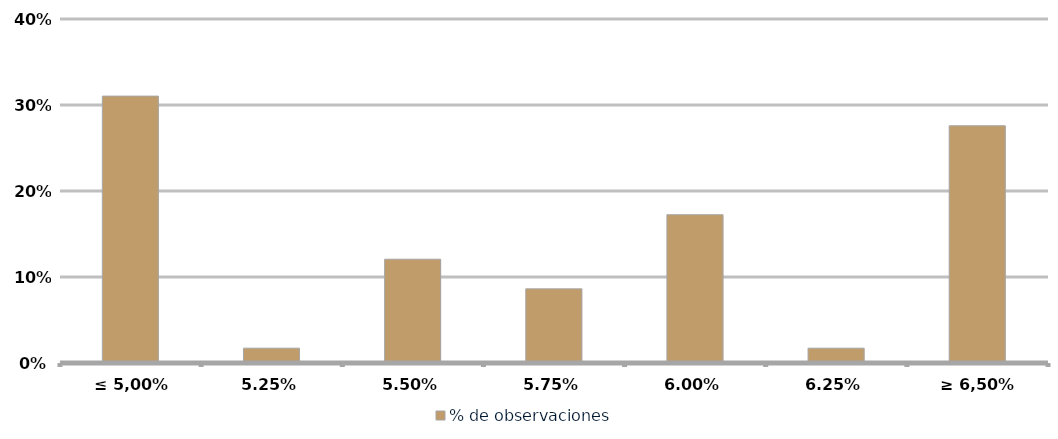
| Category | % de observaciones  |
|---|---|
| ≤ 5,00% | 0.31 |
| 5,25% | 0.017 |
| 5,50% | 0.121 |
| 5,75% | 0.086 |
| 6,00% | 0.172 |
| 6,25% | 0.017 |
| ≥ 6,50% | 0.276 |